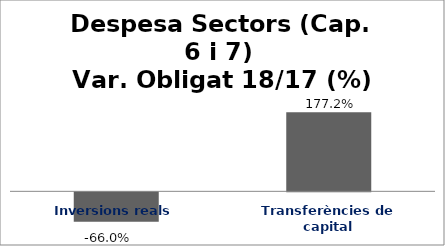
| Category | Series 0 |
|---|---|
| Inversions reals | -0.66 |
| Transferències de capital | 1.772 |